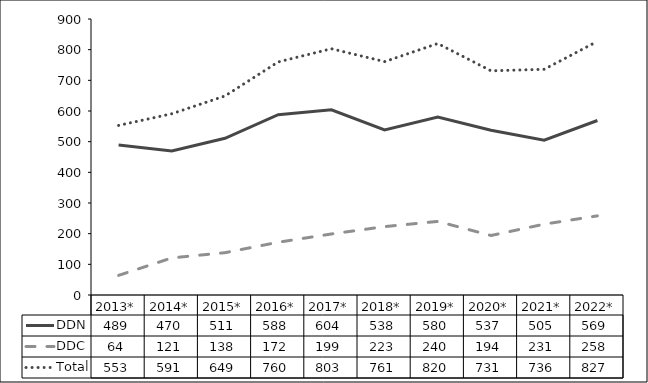
| Category | DDN | DDC | Total |
|---|---|---|---|
| 2013* | 489 | 64 | 553 |
| 2014* | 470 | 121 | 591 |
| 2015* | 511 | 138 | 649 |
| 2016* | 588 | 172 | 760 |
| 2017* | 604 | 199 | 803 |
| 2018* | 538 | 223 | 761 |
| 2019* | 580 | 240 | 820 |
| 2020* | 537 | 194 | 731 |
| 2021* | 505 | 231 | 736 |
| 2022* | 569 | 258 | 827 |